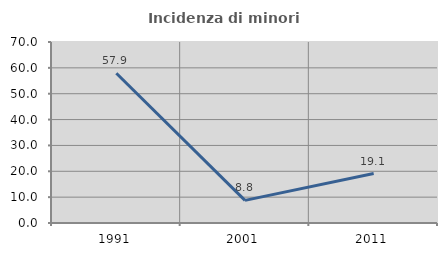
| Category | Incidenza di minori stranieri |
|---|---|
| 1991.0 | 57.903 |
| 2001.0 | 8.757 |
| 2011.0 | 19.13 |